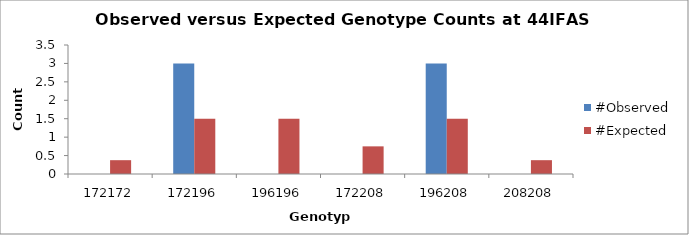
| Category | #Observed | #Expected |
|---|---|---|
| 172172.0 | 0 | 0.375 |
| 172196.0 | 3 | 1.5 |
| 196196.0 | 0 | 1.5 |
| 172208.0 | 0 | 0.75 |
| 196208.0 | 3 | 1.5 |
| 208208.0 | 0 | 0.375 |